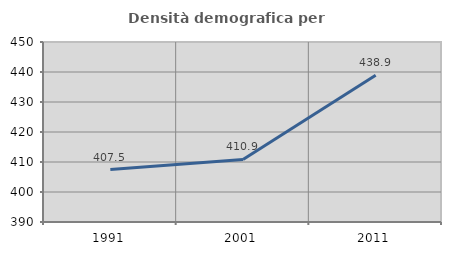
| Category | Densità demografica |
|---|---|
| 1991.0 | 407.479 |
| 2001.0 | 410.855 |
| 2011.0 | 438.916 |